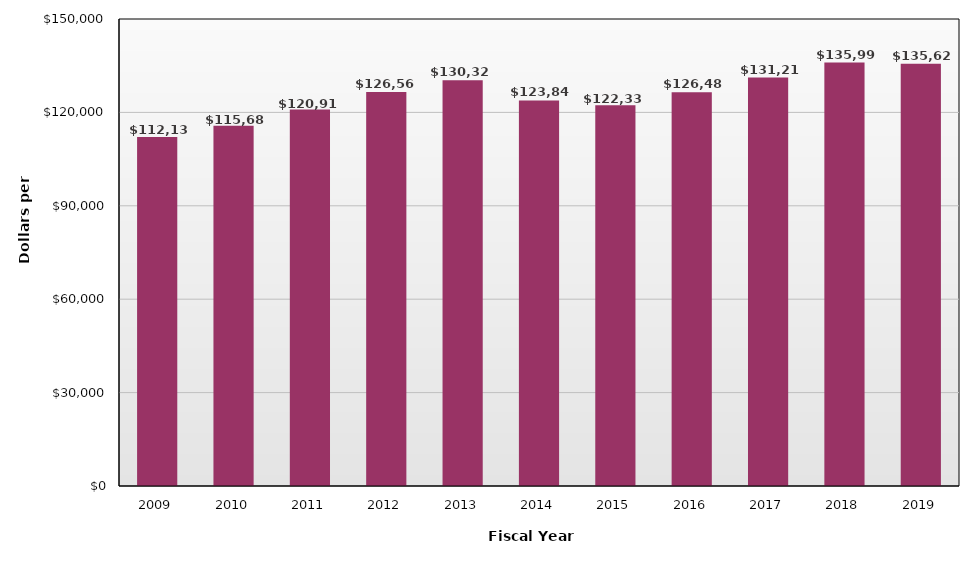
| Category | Total Revenue |
|---|---|
| 2009.0 | 112135 |
| 2010.0 | 115680 |
| 2011.0 | 120916 |
| 2012.0 | 126566 |
| 2013.0 | 130329 |
| 2014.0 | 123845 |
| 2015.0 | 122332 |
| 2016.0 | 126489 |
| 2017.0 | 131211 |
| 2018.0 | 135995 |
| 2019.0 | 135628 |